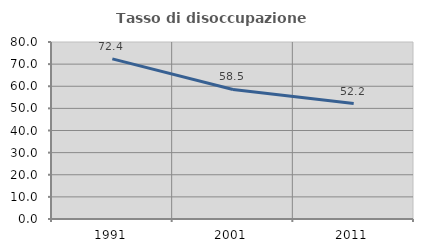
| Category | Tasso di disoccupazione giovanile  |
|---|---|
| 1991.0 | 72.368 |
| 2001.0 | 58.537 |
| 2011.0 | 52.174 |